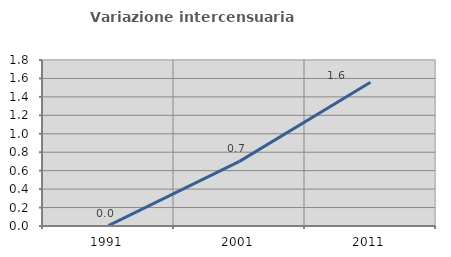
| Category | Variazione intercensuaria annua |
|---|---|
| 1991.0 | 0.004 |
| 2001.0 | 0.701 |
| 2011.0 | 1.559 |